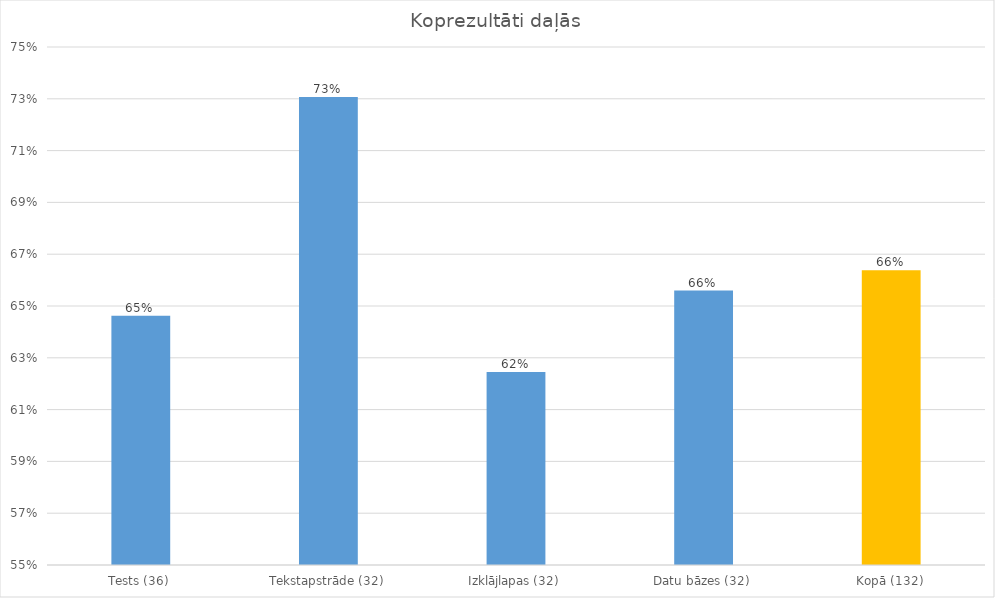
| Category | Series 0 |
|---|---|
| Tests (36) | 0.646 |
| Tekstapstrāde (32) | 0.731 |
| Izklājlapas (32) | 0.624 |
| Datu bāzes (32) | 0.656 |
| Kopā (132) | 0.664 |